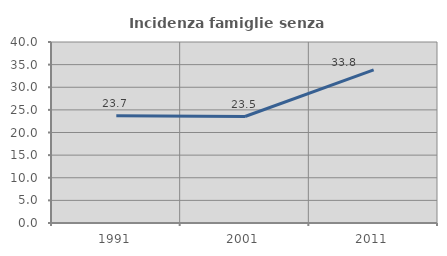
| Category | Incidenza famiglie senza nuclei |
|---|---|
| 1991.0 | 23.684 |
| 2001.0 | 23.529 |
| 2011.0 | 33.824 |